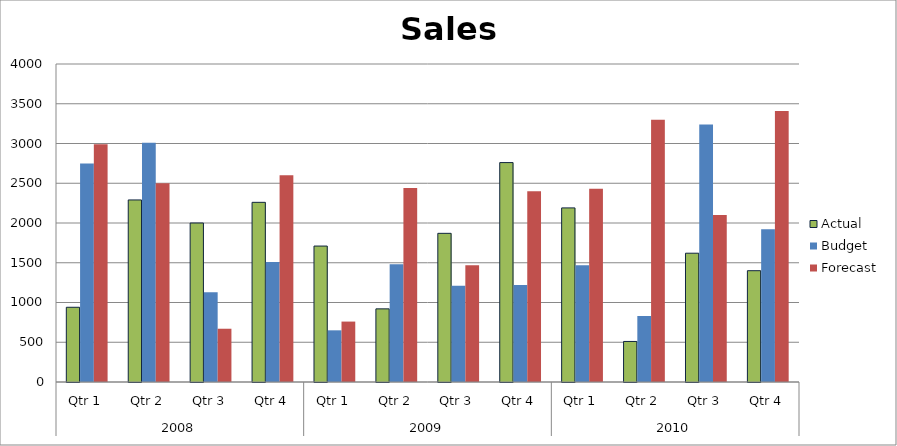
| Category | Actual | Budget | Forecast |
|---|---|---|---|
| 0 | 940 | 2750 | 2990 |
| 1 | 2290 | 3010 | 2500 |
| 2 | 2000 | 1130 | 670 |
| 3 | 2260 | 1510 | 2600 |
| 4 | 1710 | 650 | 760 |
| 5 | 920 | 1480 | 2440 |
| 6 | 1870 | 1210 | 1470 |
| 7 | 2760 | 1220 | 2400 |
| 8 | 2190 | 1470 | 2430 |
| 9 | 510 | 830 | 3300 |
| 10 | 1620 | 3240 | 2100 |
| 11 | 1400 | 1920 | 3410 |